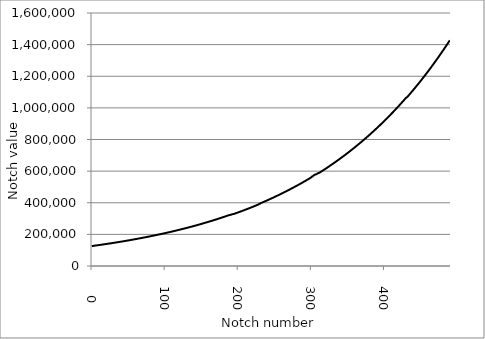
| Category | Notch values |
|---|---|
| 1.0 | 125085 |
| 2.0 | 126720 |
| 3.0 | 126960 |
| 4.0 | 127998 |
| 5.0 | 128622 |
| 6.0 | 129255 |
| 7.0 | 129918 |
| 8.0 | 130554 |
| 9.0 | 131193 |
| 10.0 | 131844 |
| 11.0 | 132513 |
| 12.0 | 133173 |
| 13.0 | 133821 |
| 14.0 | 134475 |
| 15.0 | 135171 |
| 16.0 | 135852 |
| 17.0 | 136491 |
| 18.0 | 137208 |
| 19.0 | 137889 |
| 20.0 | 138600 |
| 21.0 | 139266 |
| 22.0 | 139959 |
| 23.0 | 140679 |
| 24.0 | 141357 |
| 25.0 | 142059 |
| 26.0 | 142770 |
| 27.0 | 143478 |
| 28.0 | 144186 |
| 29.0 | 144912 |
| 30.0 | 145629 |
| 31.0 | 146349 |
| 32.0 | 147105 |
| 33.0 | 147813 |
| 34.0 | 148542 |
| 35.0 | 149313 |
| 36.0 | 150075 |
| 37.0 | 150771 |
| 38.0 | 151572 |
| 39.0 | 152325 |
| 40.0 | 153072 |
| 41.0 | 153846 |
| 42.0 | 154596 |
| 43.0 | 155367 |
| 44.0 | 156159 |
| 45.0 | 156915 |
| 46.0 | 157713 |
| 47.0 | 158502 |
| 48.0 | 159291 |
| 49.0 | 160080 |
| 50.0 | 160863 |
| 51.0 | 161679 |
| 52.0 | 162663 |
| 53.0 | 163275 |
| 54.0 | 164283 |
| 55.0 | 165102 |
| 56.0 | 165930 |
| 57.0 | 166746 |
| 58.0 | 167613 |
| 59.0 | 168420 |
| 60.0 | 169275 |
| 61.0 | 170127 |
| 62.0 | 170949 |
| 63.0 | 171813 |
| 64.0 | 172680 |
| 65.0 | 173514 |
| 66.0 | 174378 |
| 67.0 | 175269 |
| 68.0 | 176142 |
| 69.0 | 176994 |
| 70.0 | 177897 |
| 71.0 | 178785 |
| 72.0 | 179646 |
| 73.0 | 180564 |
| 74.0 | 181491 |
| 75.0 | 182340 |
| 76.0 | 183276 |
| 77.0 | 184212 |
| 78.0 | 185127 |
| 79.0 | 186024 |
| 80.0 | 186975 |
| 81.0 | 187905 |
| 82.0 | 188841 |
| 83.0 | 189780 |
| 84.0 | 190728 |
| 85.0 | 191673 |
| 86.0 | 192642 |
| 87.0 | 193590 |
| 88.0 | 194559 |
| 89.0 | 195531 |
| 90.0 | 196503 |
| 91.0 | 197478 |
| 92.0 | 198483 |
| 93.0 | 199452 |
| 94.0 | 200484 |
| 95.0 | 201459 |
| 96.0 | 202482 |
| 97.0 | 203490 |
| 98.0 | 204507 |
| 99.0 | 205518 |
| 100.0 | 206532 |
| 101.0 | 207576 |
| 102.0 | 208590 |
| 103.0 | 209631 |
| 104.0 | 210675 |
| 105.0 | 211719 |
| 106.0 | 212793 |
| 107.0 | 213834 |
| 108.0 | 214908 |
| 109.0 | 215985 |
| 110.0 | 217062 |
| 111.0 | 218133 |
| 112.0 | 219255 |
| 113.0 | 220317 |
| 114.0 | 221415 |
| 115.0 | 222543 |
| 116.0 | 223638 |
| 117.0 | 224736 |
| 118.0 | 225876 |
| 119.0 | 226992 |
| 120.0 | 228144 |
| 121.0 | 229263 |
| 122.0 | 230409 |
| 123.0 | 231567 |
| 124.0 | 232707 |
| 125.0 | 233865 |
| 126.0 | 235023 |
| 127.0 | 236199 |
| 128.0 | 237387 |
| 129.0 | 238548 |
| 130.0 | 239790 |
| 131.0 | 240948 |
| 132.0 | 242160 |
| 133.0 | 243387 |
| 134.0 | 244593 |
| 135.0 | 245793 |
| 136.0 | 247029 |
| 137.0 | 248262 |
| 138.0 | 249516 |
| 139.0 | 250734 |
| 140.0 | 251997 |
| 141.0 | 253260 |
| 142.0 | 254532 |
| 143.0 | 255777 |
| 144.0 | 257070 |
| 145.0 | 258351 |
| 146.0 | 259647 |
| 147.0 | 260925 |
| 148.0 | 262236 |
| 149.0 | 263541 |
| 150.0 | 264855 |
| 151.0 | 266169 |
| 152.0 | 267768 |
| 153.0 | 268827 |
| 154.0 | 270432 |
| 155.0 | 271785 |
| 156.0 | 273150 |
| 157.0 | 274488 |
| 158.0 | 275871 |
| 159.0 | 277248 |
| 160.0 | 278640 |
| 161.0 | 280008 |
| 162.0 | 281424 |
| 163.0 | 282819 |
| 164.0 | 284238 |
| 165.0 | 285645 |
| 166.0 | 287067 |
| 167.0 | 288501 |
| 168.0 | 289932 |
| 169.0 | 291372 |
| 170.0 | 292854 |
| 171.0 | 294282 |
| 172.0 | 295773 |
| 173.0 | 297246 |
| 174.0 | 298746 |
| 175.0 | 300210 |
| 176.0 | 301719 |
| 177.0 | 303228 |
| 178.0 | 304746 |
| 179.0 | 306246 |
| 180.0 | 307791 |
| 181.0 | 309318 |
| 182.0 | 310869 |
| 183.0 | 312408 |
| 184.0 | 313977 |
| 185.0 | 315531 |
| 186.0 | 317106 |
| 187.0 | 318687 |
| 188.0 | 320271 |
| 189.0 | 321864 |
| 190.0 | 323004 |
| 191.0 | 323661 |
| 192.0 | 325074 |
| 193.0 | 326895 |
| 194.0 | 327849 |
| 195.0 | 328515 |
| 196.0 | 330156 |
| 197.0 | 331797 |
| 198.0 | 333444 |
| 199.0 | 335109 |
| 200.0 | 336789 |
| 201.0 | 338445 |
| 202.0 | 340155 |
| 203.0 | 341841 |
| 204.0 | 343548 |
| 205.0 | 345258 |
| 206.0 | 346995 |
| 207.0 | 348702 |
| 208.0 | 350475 |
| 209.0 | 352200 |
| 210.0 | 353979 |
| 211.0 | 355731 |
| 212.0 | 357501 |
| 213.0 | 359289 |
| 214.0 | 361092 |
| 215.0 | 362865 |
| 216.0 | 364680 |
| 217.0 | 366507 |
| 218.0 | 368355 |
| 219.0 | 370149 |
| 220.0 | 372009 |
| 221.0 | 373881 |
| 222.0 | 375747 |
| 223.0 | 377589 |
| 224.0 | 379497 |
| 225.0 | 381384 |
| 226.0 | 383307 |
| 227.0 | 385188 |
| 228.0 | 387126 |
| 229.0 | 389058 |
| 230.0 | 392934 |
| 231.0 | 393120 |
| 232.0 | 397056 |
| 233.0 | 399018 |
| 234.0 | 401049 |
| 235.0 | 403011 |
| 236.0 | 405024 |
| 237.0 | 407064 |
| 238.0 | 409095 |
| 239.0 | 411099 |
| 240.0 | 413169 |
| 241.0 | 415230 |
| 242.0 | 417315 |
| 243.0 | 419367 |
| 244.0 | 421473 |
| 245.0 | 423576 |
| 246.0 | 425685 |
| 247.0 | 427794 |
| 248.0 | 429963 |
| 249.0 | 432069 |
| 250.0 | 434256 |
| 251.0 | 436413 |
| 252.0 | 438612 |
| 253.0 | 440769 |
| 254.0 | 442995 |
| 255.0 | 445191 |
| 256.0 | 447435 |
| 257.0 | 449640 |
| 258.0 | 451899 |
| 259.0 | 454146 |
| 260.0 | 456411 |
| 261.0 | 458676 |
| 262.0 | 460959 |
| 263.0 | 463257 |
| 264.0 | 465570 |
| 265.0 | 467874 |
| 266.0 | 470259 |
| 267.0 | 472554 |
| 268.0 | 474945 |
| 269.0 | 477312 |
| 270.0 | 479697 |
| 271.0 | 482070 |
| 272.0 | 484479 |
| 273.0 | 486891 |
| 274.0 | 489312 |
| 275.0 | 491745 |
| 276.0 | 494226 |
| 277.0 | 496653 |
| 278.0 | 499164 |
| 279.0 | 501639 |
| 280.0 | 504147 |
| 281.0 | 506652 |
| 282.0 | 509184 |
| 283.0 | 511710 |
| 284.0 | 514281 |
| 285.0 | 516822 |
| 286.0 | 519429 |
| 287.0 | 521994 |
| 288.0 | 524637 |
| 289.0 | 527220 |
| 290.0 | 529866 |
| 291.0 | 532506 |
| 292.0 | 535140 |
| 293.0 | 537813 |
| 294.0 | 540534 |
| 295.0 | 543168 |
| 296.0 | 545916 |
| 297.0 | 548643 |
| 298.0 | 551376 |
| 299.0 | 554106 |
| 300.0 | 556902 |
| 301.0 | 559647 |
| 302.0 | 565257 |
| 303.0 | 565527 |
| 304.0 | 571188 |
| 305.0 | 574011 |
| 306.0 | 576873 |
| 307.0 | 579078 |
| 308.0 | 579756 |
| 309.0 | 582936 |
| 310.0 | 585525 |
| 311.0 | 587763 |
| 312.0 | 588771 |
| 313.0 | 591681 |
| 314.0 | 594675 |
| 315.0 | 597603 |
| 316.0 | 600588 |
| 317.0 | 603594 |
| 318.0 | 606612 |
| 319.0 | 609597 |
| 320.0 | 612681 |
| 321.0 | 615711 |
| 322.0 | 618816 |
| 323.0 | 621870 |
| 324.0 | 624987 |
| 325.0 | 628098 |
| 326.0 | 631236 |
| 327.0 | 634362 |
| 328.0 | 637563 |
| 329.0 | 640704 |
| 330.0 | 643944 |
| 331.0 | 647127 |
| 332.0 | 650376 |
| 333.0 | 653604 |
| 334.0 | 656874 |
| 335.0 | 660132 |
| 336.0 | 663441 |
| 337.0 | 666726 |
| 338.0 | 670089 |
| 339.0 | 673392 |
| 340.0 | 676773 |
| 341.0 | 680139 |
| 342.0 | 683547 |
| 343.0 | 686925 |
| 344.0 | 690399 |
| 345.0 | 693801 |
| 346.0 | 697284 |
| 347.0 | 700755 |
| 348.0 | 704265 |
| 349.0 | 707742 |
| 350.0 | 711294 |
| 351.0 | 714828 |
| 352.0 | 718407 |
| 353.0 | 721962 |
| 354.0 | 725616 |
| 355.0 | 729183 |
| 356.0 | 732852 |
| 357.0 | 736500 |
| 358.0 | 740196 |
| 359.0 | 743844 |
| 360.0 | 747594 |
| 361.0 | 751299 |
| 362.0 | 755061 |
| 363.0 | 758808 |
| 364.0 | 762609 |
| 365.0 | 766386 |
| 366.0 | 770220 |
| 367.0 | 774048 |
| 368.0 | 777942 |
| 369.0 | 781773 |
| 370.0 | 785703 |
| 371.0 | 789612 |
| 372.0 | 793572 |
| 373.0 | 797490 |
| 374.0 | 801510 |
| 375.0 | 805476 |
| 376.0 | 809532 |
| 377.0 | 813534 |
| 378.0 | 817602 |
| 379.0 | 821676 |
| 380.0 | 825780 |
| 381.0 | 829866 |
| 382.0 | 834033 |
| 383.0 | 838167 |
| 384.0 | 842391 |
| 385.0 | 846543 |
| 386.0 | 850830 |
| 387.0 | 855027 |
| 388.0 | 859332 |
| 389.0 | 863592 |
| 390.0 | 867909 |
| 391.0 | 872223 |
| 392.0 | 876609 |
| 393.0 | 880929 |
| 394.0 | 885372 |
| 395.0 | 889758 |
| 396.0 | 894201 |
| 397.0 | 898653 |
| 398.0 | 903165 |
| 399.0 | 907614 |
| 400.0 | 912201 |
| 401.0 | 916713 |
| 402.0 | 921306 |
| 403.0 | 925884 |
| 404.0 | 930504 |
| 405.0 | 935127 |
| 406.0 | 939819 |
| 407.0 | 944463 |
| 408.0 | 949221 |
| 409.0 | 953916 |
| 410.0 | 958695 |
| 411.0 | 963459 |
| 412.0 | 968295 |
| 413.0 | 973074 |
| 414.0 | 977988 |
| 415.0 | 982818 |
| 416.0 | 987756 |
| 417.0 | 992658 |
| 418.0 | 997626 |
| 419.0 | 1002573 |
| 420.0 | 1007610 |
| 421.0 | 1012590 |
| 422.0 | 1017690 |
| 423.0 | 1022724 |
| 424.0 | 1027875 |
| 425.0 | 1032954 |
| 426.0 | 1038126 |
| 427.0 | 1043292 |
| 428.0 | 1048527 |
| 429.0 | 1053699 |
| 430.0 | 1059012 |
| 431.0 | 1064256 |
| 432.0 | 1066416 |
| 433.0 | 1071099 |
| 434.0 | 1076457 |
| 435.0 | 1081821 |
| 436.0 | 1087230 |
| 437.0 | 1092636 |
| 438.0 | 1098099 |
| 439.0 | 1103556 |
| 440.0 | 1109073 |
| 441.0 | 1114587 |
| 442.0 | 1120158 |
| 443.0 | 1125720 |
| 444.0 | 1131348 |
| 445.0 | 1136988 |
| 446.0 | 1142673 |
| 447.0 | 1148358 |
| 448.0 | 1154100 |
| 449.0 | 1159830 |
| 450.0 | 1165629 |
| 451.0 | 1171440 |
| 452.0 | 1177296 |
| 453.0 | 1183149 |
| 454.0 | 1189065 |
| 455.0 | 1194978 |
| 456.0 | 1200951 |
| 457.0 | 1206906 |
| 458.0 | 1212942 |
| 459.0 | 1218966 |
| 460.0 | 1225062 |
| 461.0 | 1231170 |
| 462.0 | 1237326 |
| 463.0 | 1243479 |
| 464.0 | 1249695 |
| 465.0 | 1255899 |
| 466.0 | 1262178 |
| 467.0 | 1268466 |
| 468.0 | 1274808 |
| 469.0 | 1281153 |
| 470.0 | 1287561 |
| 471.0 | 1293969 |
| 472.0 | 1300440 |
| 473.0 | 1306896 |
| 474.0 | 1313430 |
| 475.0 | 1319949 |
| 476.0 | 1326549 |
| 477.0 | 1333164 |
| 478.0 | 1339830 |
| 479.0 | 1346478 |
| 480.0 | 1353210 |
| 481.0 | 1359933 |
| 482.0 | 1366734 |
| 483.0 | 1373544 |
| 484.0 | 1380411 |
| 485.0 | 1387281 |
| 486.0 | 1394217 |
| 487.0 | 1401153 |
| 488.0 | 1408161 |
| 489.0 | 1415148 |
| 490.0 | 1422225 |
| 491.0 | 1425018 |